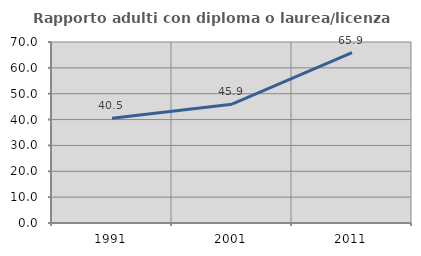
| Category | Rapporto adulti con diploma o laurea/licenza media  |
|---|---|
| 1991.0 | 40.496 |
| 2001.0 | 45.946 |
| 2011.0 | 65.877 |